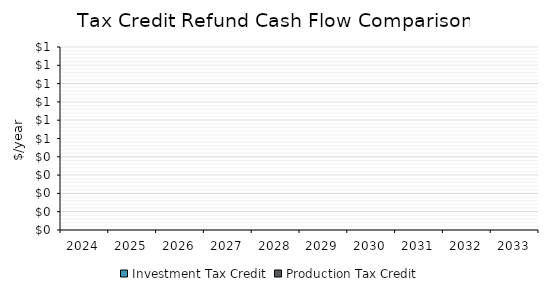
| Category | Investment Tax Credit | Production Tax Credit |
|---|---|---|
| 2024.0 | 0 | 0 |
| 2025.0 | 0 | 0 |
| 2026.0 | 0 | 0 |
| 2027.0 | 0 | 0 |
| 2028.0 | 0 | 0 |
| 2029.0 | 0 | 0 |
| 2030.0 | 0 | 0 |
| 2031.0 | 0 | 0 |
| 2032.0 | 0 | 0 |
| 2033.0 | 0 | 0 |